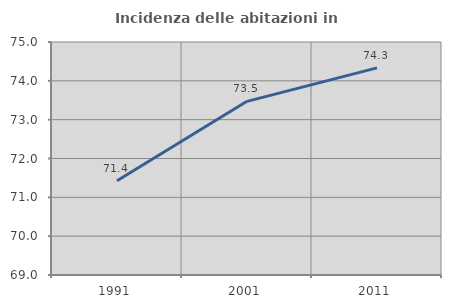
| Category | Incidenza delle abitazioni in proprietà  |
|---|---|
| 1991.0 | 71.429 |
| 2001.0 | 73.472 |
| 2011.0 | 74.334 |